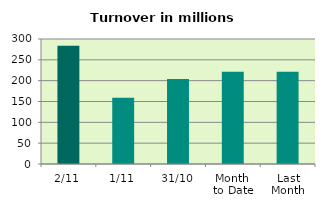
| Category | Series 0 |
|---|---|
| 2/11 | 283.962 |
| 1/11 | 158.934 |
| 31/10 | 203.739 |
| Month 
to Date | 221.448 |
| Last
Month | 221.516 |